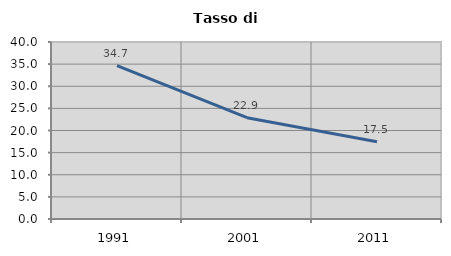
| Category | Tasso di disoccupazione   |
|---|---|
| 1991.0 | 34.668 |
| 2001.0 | 22.897 |
| 2011.0 | 17.474 |